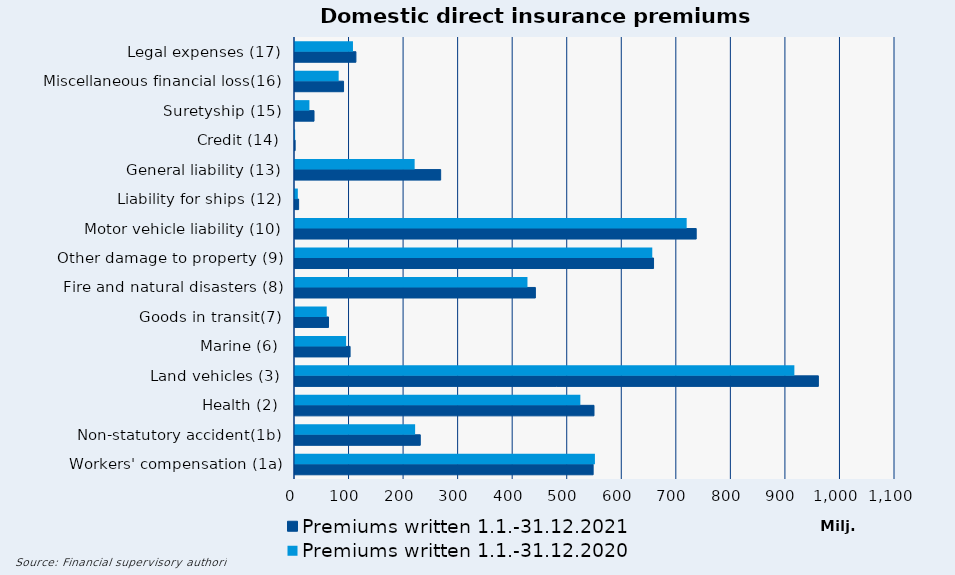
| Category | Premiums written |
|---|---|
| Workers' compensation (1a) | 549843.422 |
| Non-statutory accident(1b) | 220226.856 |
| Health (2) | 523129.933 |
| Land vehicles (3) | 915498.982 |
| Marine (6) | 93668.316 |
| Goods in transit(7) | 58177.492 |
| Fire and natural disasters (8) | 426182.783 |
| Other damage to property (9) | 655020.47 |
| Motor vehicle liability (10) | 718074.556 |
| Liability for ships (12) | 5170.486 |
| General liability (13) | 219343.744 |
| Credit (14) | 250.786 |
| Suretyship (15) | 26408.731 |
| Miscellaneous financial loss(16) | 80054.151 |
| Legal expenses (17) | 106279.304 |